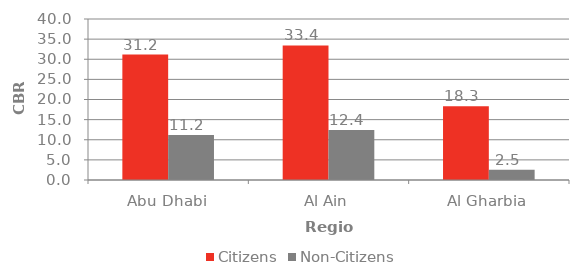
| Category | Citizens | Non-Citizens |
|---|---|---|
| Abu Dhabi | 31.174 | 11.208 |
| Al Ain | 33.442 | 12.421 |
| Al Gharbia | 18.318 | 2.53 |